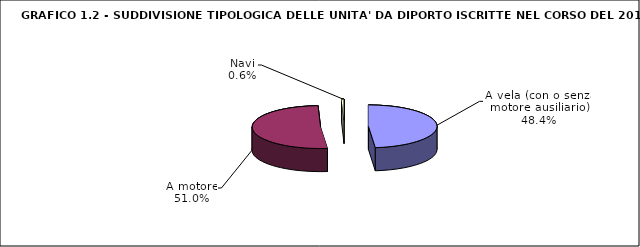
| Category | Series 0 |
|---|---|
| A vela (con o senza motore ausiliario) | 588 |
| A motore | 620 |
| Navi | 7 |